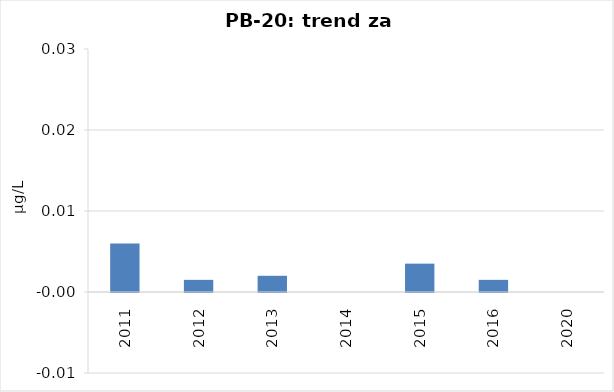
| Category | Vsota |
|---|---|
| 2011 | 0.006 |
| 2012 | 0.002 |
| 2013 | 0.002 |
| 2014 | 0 |
| 2015 | 0.004 |
| 2016 | 0.002 |
| 2020 | 0 |